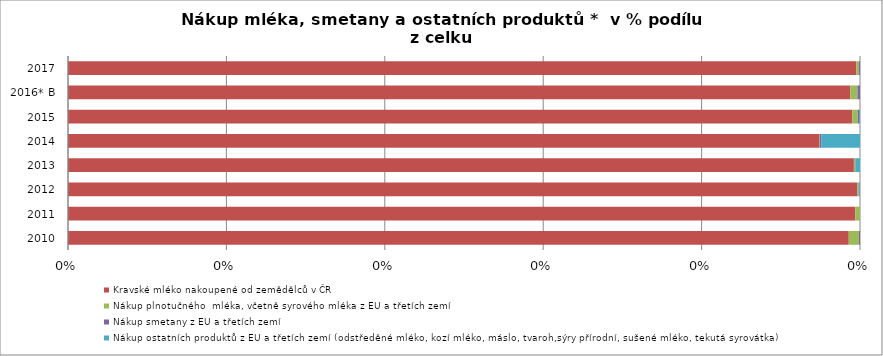
| Category | Kravské mléko nakoupené od zemědělců v ČR | Nákup plnotučného  mléka, včetně syrového mléka z EU a třetích zemí | Nákup smetany z EU a třetích zemí | Nákup ostatních produktů z EU a třetích zemí (odstředěné mléko, kozí mléko, máslo, tvaroh,sýry přírodní, sušené mléko, tekutá syrovátka)   |
|---|---|---|---|---|
| 2010 | 2312.226 | 30.314 | 2.962 | 0 |
| 2011 | 2366.104 | 13.967 | 0 | 0 |
| 2012 | 2428.774 | 4.057 | 1.988 | 2.58 |
| 2013 | 2358.416 | 3.377 | 1.621 | 13.31 |
| 2014 | 2370.204 | 1.211 | 3.843 | 122.48 |
| 2015 | 2481.55 | 17.275 | 4.115 | 3.022 |
| 2016* B | 2793.2 | 25.238 | 9.08 | 0 |
| 2017 | 2979.336 | 9.576 | 4.5 | 0 |